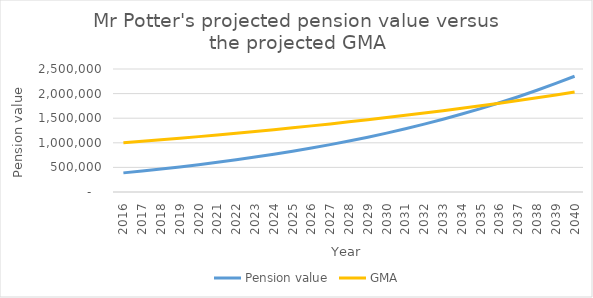
| Category | Pension value | GMA |
|---|---|---|
| 2016.0 | 388587.57 | 1000000 |
| 2017.0 | 425945.474 | 1030000 |
| 2018.0 | 465551.867 | 1060900 |
| 2019.0 | 507524.802 | 1092727 |
| 2020.0 | 553644.638 | 1125508.81 |
| 2021.0 | 602542.364 | 1159274.074 |
| 2022.0 | 654365.809 | 1194052.297 |
| 2023.0 | 709270.295 | 1229873.865 |
| 2024.0 | 767419.012 | 1266770.081 |
| 2025.0 | 828983.408 | 1304773.184 |
| 2026.0 | 894143.604 | 1343916.379 |
| 2027.0 | 963088.825 | 1384233.871 |
| 2028.0 | 1036017.853 | 1425760.887 |
| 2029.0 | 1113139.503 | 1468533.713 |
| 2030.0 | 1197125.066 | 1512589.725 |
| 2031.0 | 1285985.944 | 1557967.417 |
| 2032.0 | 1379980.895 | 1604706.439 |
| 2033.0 | 1479381.938 | 1652847.632 |
| 2034.0 | 1584475.036 | 1702433.061 |
| 2035.0 | 1695560.8 | 1753506.053 |
| 2036.0 | 1812955.231 | 1806111.235 |
| 2037.0 | 1936990.506 | 1860294.572 |
| 2038.0 | 2068015.795 | 1916103.409 |
| 2039.0 | 2206398.126 | 1973586.511 |
| 2040.0 | 2352523.295 | 2032794.106 |